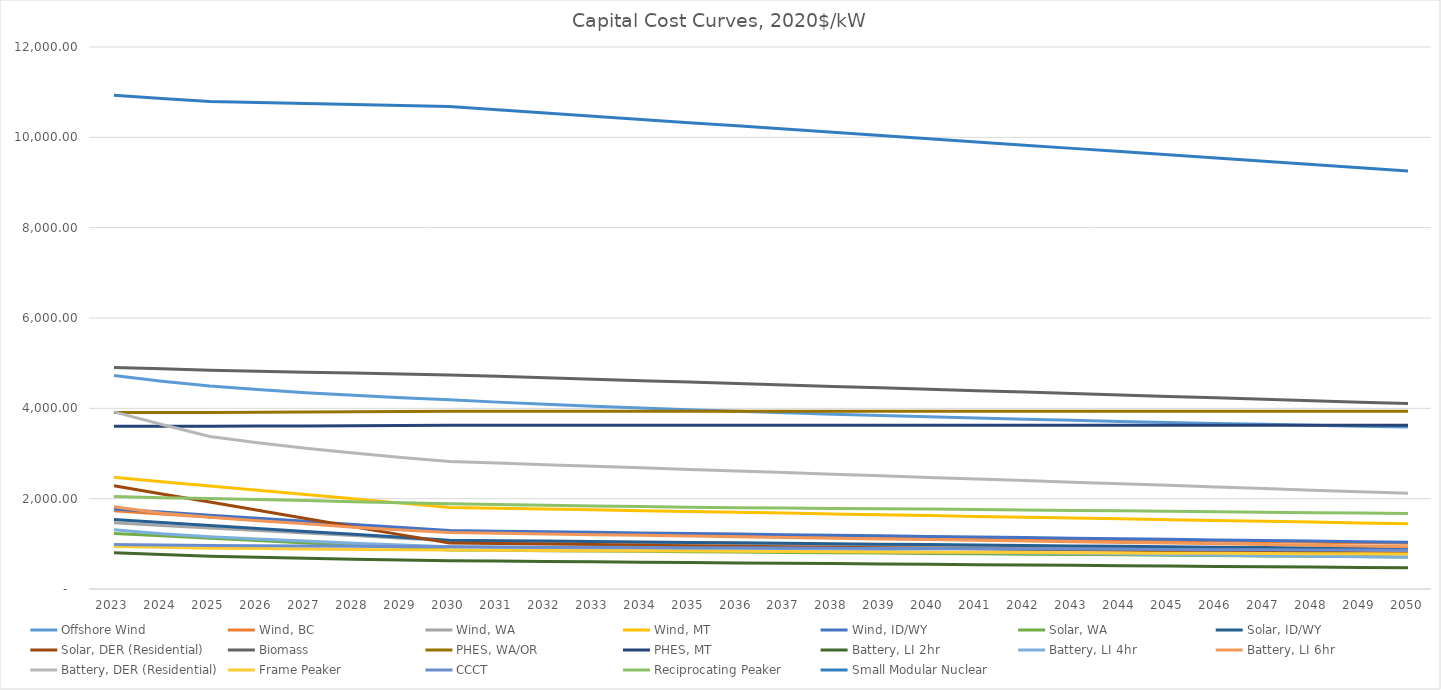
| Category | Offshore Wind | Wind, BC | Wind, WA | Wind, MT | Wind, ID/WY | Solar, WA | Solar, ID/WY | Solar, DER (Residential) | Biomass | PHES, WA/OR | PHES, MT | Battery, LI 2hr | Battery, LI 4hr | Battery, LI 6hr | Battery, DER (Residential) | Frame Peaker | CCCT | Reciprocating Peaker | Small Modular Nuclear |
|---|---|---|---|---|---|---|---|---|---|---|---|---|---|---|---|---|---|---|---|
| 2023.0 | 4728.164 | 1730.4 | 1464.4 | 2472.4 | 1771.525 | 1229.784 | 1536.909 | 2286.984 | 4905.547 | 3910.062 | 3602.062 | 804.037 | 1313.708 | 1823.38 | 3922.573 | 943.716 | 987.089 | 2045.246 | 10930.335 |
| 2024.0 | 4599.86 | 1662.686 | 1407.095 | 2375.651 | 1702.202 | 1177.057 | 1471.014 | 2105.476 | 4874.181 | 3910.062 | 3602.062 | 762.686 | 1220.654 | 1679.272 | 3641.424 | 921.881 | 973.598 | 2017.682 | 10860.709 |
| 2025.0 | 4495.027 | 1594.973 | 1349.791 | 2278.901 | 1632.879 | 1124.331 | 1405.12 | 1923.968 | 4842.13 | 3910.062 | 3602.062 | 724.371 | 1154.968 | 1586.294 | 3374.637 | 904.899 | 964.604 | 2001.362 | 10791.091 |
| 2026.0 | 4415.177 | 1529.16 | 1294.095 | 2184.868 | 1565.502 | 1072.427 | 1340.254 | 1742.46 | 4821.907 | 3914.914 | 3606.531 | 702.973 | 1105.704 | 1509.529 | 3238.163 | 895.195 | 957.858 | 1982.869 | 10769.871 |
| 2027.0 | 4346.89 | 1463.18 | 1238.257 | 2090.595 | 1497.954 | 1020.441 | 1275.285 | 1560.952 | 4801.562 | 3919.768 | 3611.003 | 683.02 | 1061.914 | 1442.186 | 3117.042 | 883.065 | 949.989 | 1958.434 | 10748.279 |
| 2028.0 | 4287.417 | 1397.032 | 1182.278 | 1996.083 | 1430.234 | 968.374 | 1210.215 | 1379.444 | 4781.098 | 3924.626 | 3615.479 | 657.429 | 1012.65 | 1369.44 | 3013.052 | 875.787 | 944.367 | 1932.731 | 10726.32 |
| 2029.0 | 4234.886 | 1330.716 | 1126.156 | 1901.331 | 1362.343 | 916.226 | 1145.043 | 1197.937 | 4760.513 | 3929.487 | 3619.957 | 643.115 | 974.334 | 1307.501 | 2913.551 | 868.509 | 938.746 | 1908.015 | 10703.982 |
| 2030.0 | 4187.96 | 1264.233 | 1069.893 | 1806.34 | 1294.279 | 863.996 | 1079.769 | 1016.429 | 4739.806 | 3934.351 | 3624.438 | 624.608 | 936.017 | 1249.581 | 2823.488 | 863.657 | 935.373 | 1889.154 | 10681.265 |
| 2031.0 | 4137.43 | 1251.591 | 1059.194 | 1788.276 | 1281.336 | 856.297 | 1070.148 | 1005.161 | 4708.083 | 3934.351 | 3624.438 | 617.175 | 924.782 | 1234.521 | 2788.957 | 857.592 | 929.752 | 1872.4 | 10610.052 |
| 2032.0 | 4090.946 | 1238.949 | 1048.495 | 1770.213 | 1268.394 | 848.598 | 1060.526 | 993.894 | 4676.36 | 3934.351 | 3624.438 | 609.368 | 913.082 | 1218.901 | 2753.664 | 852.74 | 926.379 | 1855.715 | 10538.843 |
| 2033.0 | 4047.909 | 1226.306 | 1037.796 | 1752.149 | 1255.451 | 840.899 | 1050.904 | 982.626 | 4644.64 | 3934.351 | 3624.438 | 601.56 | 901.382 | 1203.281 | 2718.371 | 847.888 | 921.882 | 1839.74 | 10467.639 |
| 2034.0 | 4007.843 | 1213.664 | 1027.097 | 1734.086 | 1242.508 | 833.2 | 1041.283 | 971.359 | 4612.914 | 3934.351 | 3624.438 | 593.753 | 889.682 | 1187.661 | 2683.078 | 844.249 | 918.51 | 1826.315 | 10396.422 |
| 2035.0 | 3970.363 | 1201.022 | 1016.398 | 1716.023 | 1229.565 | 825.501 | 1031.661 | 960.091 | 4581.192 | 3934.351 | 3624.438 | 585.945 | 877.981 | 1172.042 | 2647.785 | 839.397 | 914.013 | 1811.82 | 10325.215 |
| 2036.0 | 3935.156 | 1188.379 | 1005.7 | 1697.959 | 1216.622 | 817.802 | 1022.039 | 948.824 | 4549.47 | 3934.351 | 3624.438 | 578.137 | 866.281 | 1156.422 | 2612.491 | 834.545 | 910.64 | 1799.702 | 10254.005 |
| 2037.0 | 3901.962 | 1175.737 | 995.001 | 1679.896 | 1203.68 | 810.103 | 1012.418 | 937.556 | 4517.75 | 3934.351 | 3624.438 | 570.33 | 854.581 | 1140.802 | 2577.198 | 829.693 | 906.143 | 1791.877 | 10182.802 |
| 2038.0 | 3870.563 | 1163.095 | 984.302 | 1661.832 | 1190.737 | 802.404 | 1002.796 | 926.289 | 4486.027 | 3934.351 | 3624.438 | 562.522 | 842.881 | 1125.182 | 2541.905 | 826.054 | 902.77 | 1784.469 | 10111.592 |
| 2039.0 | 3840.775 | 1150.452 | 973.603 | 1643.769 | 1177.794 | 794.705 | 993.174 | 915.021 | 4454.305 | 3934.351 | 3624.438 | 554.714 | 831.18 | 1109.563 | 2506.612 | 821.202 | 898.273 | 1777.07 | 10040.383 |
| 2040.0 | 3812.441 | 1137.81 | 962.904 | 1625.706 | 1164.851 | 787.006 | 983.553 | 903.754 | 4422.584 | 3934.351 | 3624.438 | 546.907 | 819.48 | 1093.943 | 2471.319 | 816.35 | 894.901 | 1769.204 | 9969.178 |
| 2041.0 | 3785.425 | 1125.168 | 952.205 | 1607.642 | 1151.908 | 779.307 | 973.931 | 892.487 | 4390.858 | 3934.351 | 3624.438 | 539.099 | 807.78 | 1078.323 | 2436.025 | 811.498 | 891.528 | 1760.033 | 9897.962 |
| 2042.0 | 3759.611 | 1112.525 | 941.506 | 1589.579 | 1138.966 | 771.608 | 964.309 | 881.219 | 4359.136 | 3934.351 | 3624.438 | 531.292 | 796.08 | 1062.703 | 2400.732 | 807.859 | 887.031 | 1750.558 | 9826.753 |
| 2043.0 | 3734.895 | 1099.883 | 930.807 | 1571.516 | 1126.023 | 763.91 | 954.688 | 869.952 | 4327.414 | 3934.351 | 3624.438 | 523.484 | 784.38 | 1047.083 | 2365.439 | 803.007 | 883.658 | 1740.626 | 9755.544 |
| 2044.0 | 3711.188 | 1087.241 | 920.108 | 1553.452 | 1113.08 | 756.211 | 945.066 | 858.684 | 4295.692 | 3934.351 | 3624.438 | 515.676 | 772.679 | 1031.464 | 2330.146 | 798.155 | 879.161 | 1729.975 | 9684.335 |
| 2045.0 | 3688.411 | 1074.598 | 909.409 | 1535.389 | 1100.137 | 748.512 | 935.444 | 847.417 | 4263.973 | 3934.351 | 3624.438 | 507.869 | 760.979 | 1015.844 | 2294.853 | 793.303 | 875.788 | 1719.346 | 9613.135 |
| 2046.0 | 3666.494 | 1061.956 | 898.71 | 1517.325 | 1087.195 | 740.813 | 925.823 | 836.149 | 4232.251 | 3934.351 | 3624.438 | 500.061 | 749.279 | 1000.224 | 2259.56 | 789.664 | 871.291 | 1709.676 | 9541.925 |
| 2047.0 | 3645.374 | 1049.314 | 888.011 | 1499.262 | 1074.252 | 733.114 | 916.201 | 824.882 | 4200.528 | 3934.351 | 3624.438 | 492.254 | 737.579 | 984.604 | 2224.266 | 784.812 | 867.919 | 1699.592 | 9470.716 |
| 2048.0 | 3624.995 | 1036.671 | 877.312 | 1481.199 | 1061.309 | 725.415 | 906.579 | 813.614 | 4168.804 | 3934.351 | 3624.438 | 484.446 | 725.879 | 968.985 | 2188.973 | 781.173 | 863.422 | 1690.424 | 9399.503 |
| 2049.0 | 3605.308 | 1024.029 | 866.613 | 1463.135 | 1048.366 | 717.716 | 896.958 | 802.347 | 4137.082 | 3934.351 | 3624.438 | 476.638 | 714.178 | 953.365 | 2153.68 | 779.96 | 861.173 | 1682.488 | 9328.294 |
| 2050.0 | 3586.265 | 1011.387 | 855.915 | 1445.072 | 1035.423 | 710.017 | 887.336 | 791.079 | 4105.36 | 3934.351 | 3624.438 | 468.936 | 702.478 | 937.645 | 2117.616 | 777.534 | 858.925 | 1673.695 | 9257.086 |